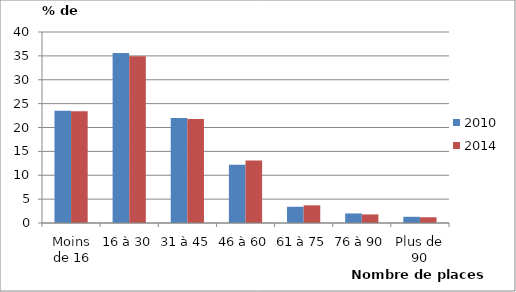
| Category | 2010 | 2014 |
|---|---|---|
| Moins de 16 | 23.5 | 23.4 |
| 16 à 30 | 35.6 | 34.9 |
| 31 à 45 | 22 | 21.8 |
| 46 à 60 | 12.2 | 13.1 |
| 61 à 75 | 3.4 | 3.7 |
| 76 à 90 | 2 | 1.8 |
| Plus de 90 | 1.3 | 1.2 |